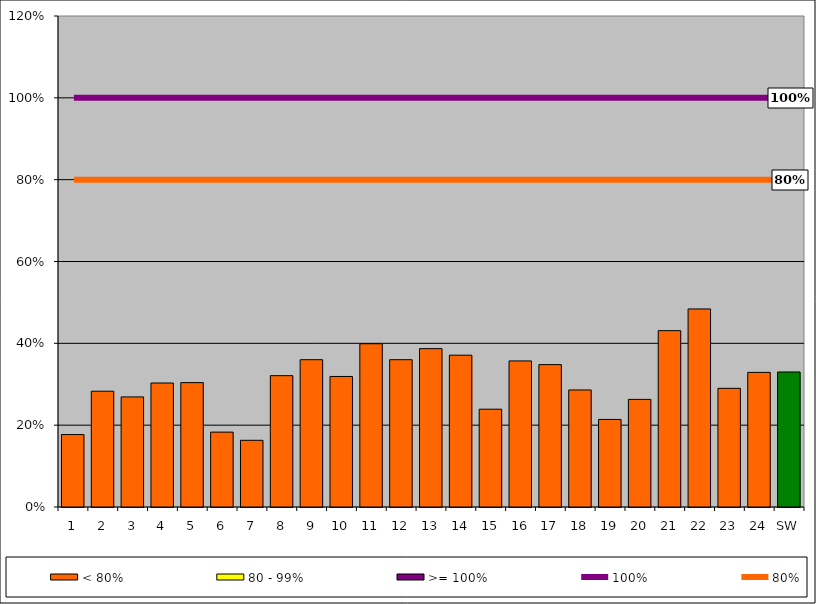
| Category | < 80% | 80 - 99% | >= 100% |
|---|---|---|---|
| 1 | 0.177 | 0 | 0 |
| 2 | 0.283 | 0 | 0 |
| 3 | 0.269 | 0 | 0 |
| 4 | 0.303 | 0 | 0 |
| 5 | 0.304 | 0 | 0 |
| 6 | 0.183 | 0 | 0 |
| 7 | 0.163 | 0 | 0 |
| 8 | 0.321 | 0 | 0 |
| 9 | 0.36 | 0 | 0 |
| 10 | 0.319 | 0 | 0 |
| 11 | 0.399 | 0 | 0 |
| 12 | 0.36 | 0 | 0 |
| 13 | 0.387 | 0 | 0 |
| 14 | 0.371 | 0 | 0 |
| 15 | 0.239 | 0 | 0 |
| 16 | 0.357 | 0 | 0 |
| 17 | 0.348 | 0 | 0 |
| 18 | 0.286 | 0 | 0 |
| 19 | 0.214 | 0 | 0 |
| 20 | 0.263 | 0 | 0 |
| 21 | 0.431 | 0 | 0 |
| 22 | 0.484 | 0 | 0 |
| 23 | 0.29 | 0 | 0 |
| 24 | 0.329 | 0 | 0 |
| SW | 0.33 | 0 | 0 |